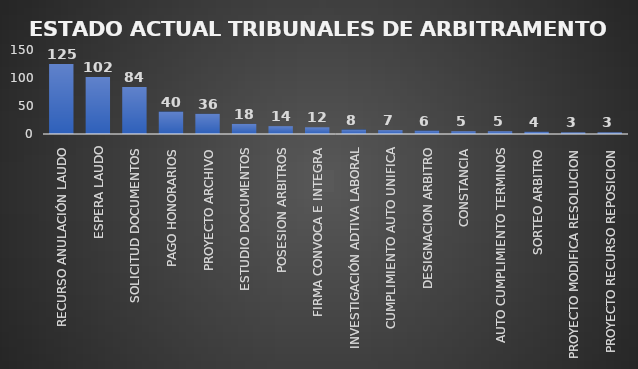
| Category | CANTIDAD | % |
|---|---|---|
| RECURSO ANULACIÓN LAUDO | 125 | 0.262 |
| ESPERA LAUDO | 102 | 0.195 |
| SOLICITUD DOCUMENTOS | 84 | 0.168 |
| PAGO HONORARIOS | 40 | 0.077 |
| PROYECTO ARCHIVO | 36 | 0.081 |
| ESTUDIO DOCUMENTOS | 18 | 0.04 |
| POSESION ARBITROS | 14 | 0.029 |
| FIRMA CONVOCA E INTEGRA | 12 | 0.027 |
| INVESTIGACIÓN ADTIVA LABORAL | 8 | 0.014 |
| CUMPLIMIENTO AUTO UNIFICA | 7 | 0.014 |
| DESIGNACION ARBITRO | 6 | 0.016 |
| CONSTANCIA | 5 | 0.015 |
| AUTO CUMPLIMIENTO TERMINOS | 5 | 0.011 |
| SORTEO ARBITRO | 4 | 0.008 |
| PROYECTO MODIFICA RESOLUCION | 3 | 0.007 |
| PROYECTO RECURSO REPOSICION | 3 | 0.006 |